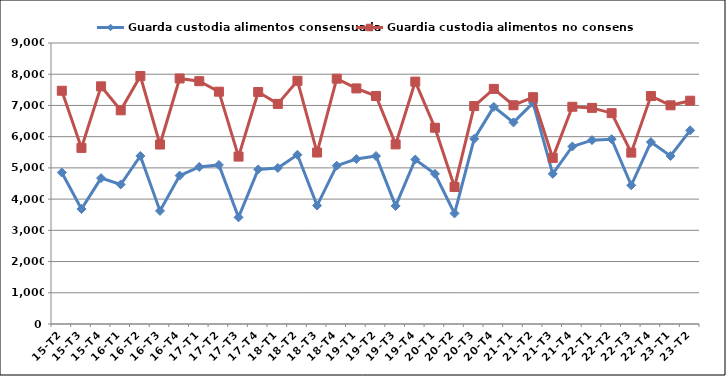
| Category | Guarda custodia alimentos consensuada | Guardia custodia alimentos no consensuada |
|---|---|---|
| 15-T2 | 4852 | 7471 |
| 15-T3 | 3684 | 5640 |
| 15-T4 | 4672 | 7612 |
| 16-T1 | 4468 | 6844 |
| 16-T2 | 5382 | 7942 |
| 16-T3 | 3622 | 5748 |
| 16-T4 | 4753 | 7864 |
| 17-T1 | 5030 | 7776 |
| 17-T2 | 5094 | 7441 |
| 17-T3 | 3417 | 5362 |
| 17-T4 | 4951 | 7432 |
| 18-T1 | 4998 | 7050 |
| 18-T2 | 5420 | 7789 |
| 18-T3 | 3793 | 5492 |
| 18-T4 | 5070 | 7857 |
| 19-T1 | 5285 | 7545 |
| 19-T2 | 5380 | 7303 |
| 19-T3 | 3782 | 5753 |
| 19-T4 | 5269 | 7763 |
| 20-T1 | 4809 | 6286 |
| 20-T2 | 3542 | 4387 |
| 20-T3 | 5930 | 6981 |
| 20-T4 | 6955 | 7530 |
| 21-T1 | 6456 | 7006 |
| 21-T2 | 7080 | 7264 |
| 21-T3 | 4810 | 5320 |
| 21-T4 | 5686 | 6958 |
| 22-T1 | 5888 | 6922 |
| 22-T2 | 5919 | 6753 |
| 22-T3 | 4443 | 5489 |
| 22-T4 | 5827 | 7302 |
| 23-T1 | 5382 | 7004 |
| 23-T2 | 6202 | 7151 |